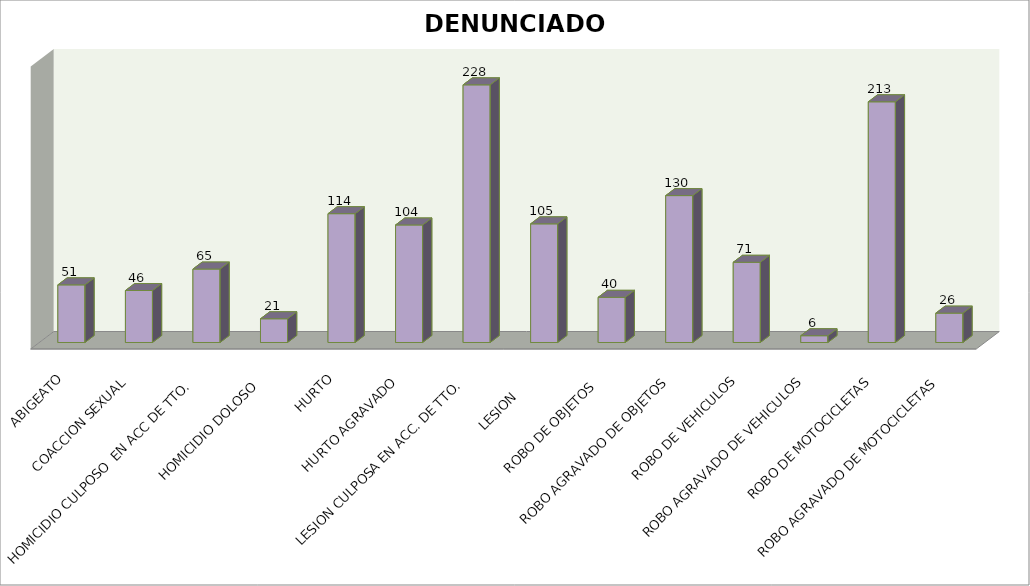
| Category | DENUNCIADOS |
|---|---|
| ABIGEATO | 51 |
| COACCION SEXUAL | 46 |
| HOMICIDIO CULPOSO  EN ACC DE TTO.  | 65 |
| HOMICIDIO DOLOSO  | 21 |
| HURTO | 114 |
| HURTO AGRAVADO | 104 |
| LESION CULPOSA EN ACC. DE TTO. | 228 |
| LESION      | 105 |
| ROBO DE OBJETOS  | 40 |
| ROBO AGRAVADO DE OBJETOS | 130 |
| ROBO DE VEHICULOS | 71 |
| ROBO AGRAVADO DE VEHICULOS | 6 |
| ROBO DE MOTOCICLETAS | 213 |
| ROBO AGRAVADO DE MOTOCICLETAS | 26 |